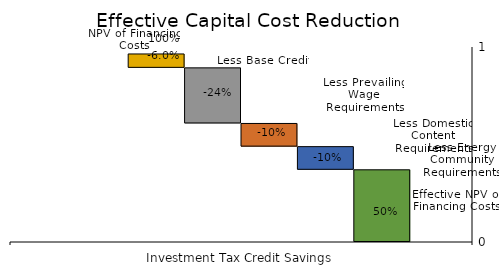
| Category | Effective NPV of Financing Costs | Less Energy Community Requirements | Less Domestic Content Requirements | Less Prevailing Wage Requirements | Less Base Credit | NPV of Financing Costs |
|---|---|---|---|---|---|---|
| 0 | 370268.864 | 118800.4 | 118800.4 | 285120.959 | 71280.24 | 0 |